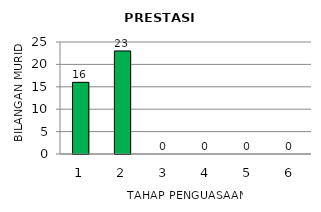
| Category | Series 0 |
|---|---|
| 1.0 | 16 |
| 2.0 | 23 |
| 3.0 | 0 |
| 4.0 | 0 |
| 5.0 | 0 |
| 6.0 | 0 |